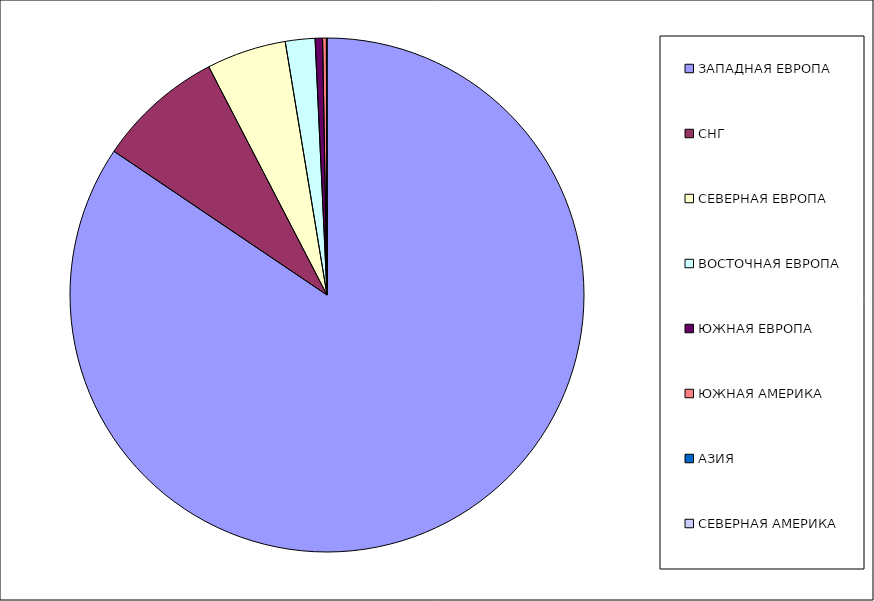
| Category | Оборот |
|---|---|
| ЗАПАДНАЯ ЕВРОПА | 0.844 |
| СНГ | 0.079 |
| СЕВЕРНАЯ ЕВРОПА | 0.05 |
| ВОСТОЧНАЯ ЕВРОПА | 0.019 |
| ЮЖНАЯ ЕВРОПА | 0.005 |
| ЮЖНАЯ АМЕРИКА | 0.002 |
| АЗИЯ | 0 |
| СЕВЕРНАЯ АМЕРИКА | 0 |